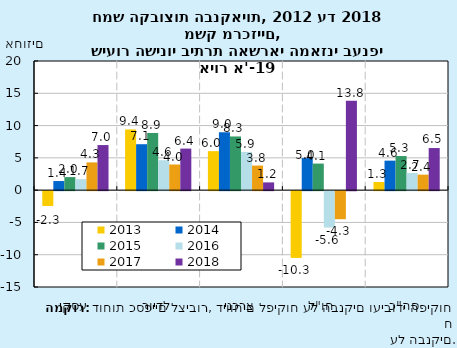
| Category | 2013 | 2014 | 2015 | 2016 | 2017 | 2018 |
|---|---|---|---|---|---|---|
| עסקי | -2.296 | 1.412 | 2.02 | 1.7 | 4.3 | 6.981 |
| לדיור | 9.398 | 7.113 | 8.856 | 4.633 | 3.969 | 6.436 |
| צרכני | 6.042 | 8.961 | 8.312 | 5.916 | 3.807 | 1.2 |
| חו"ל | -10.342 | 4.964 | 4.113 | -5.642 | -4.345 | 13.841 |
| סה"כ | 1.258 | 4.568 | 5.282 | 2.651 | 2.4 | 6.518 |